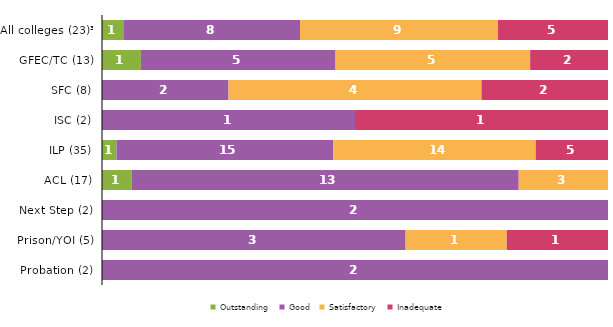
| Category | Outstanding | Good | Satisfactory | Inadequate |
|---|---|---|---|---|
| All colleges (23)³ | 1 | 8 | 9 | 5 |
| GFEC/TC (13) | 1 | 5 | 5 | 2 |
| SFC (8) | 0 | 2 | 4 | 2 |
| ISC (2) | 0 | 1 | 0 | 1 |
| ILP (35) | 1 | 15 | 14 | 5 |
| ACL (17) | 1 | 13 | 3 | 0 |
| Next Step (2) | 0 | 2 | 0 | 0 |
| Prison/YOI (5) | 0 | 3 | 1 | 1 |
| Probation (2) | 0 | 2 | 0 | 0 |